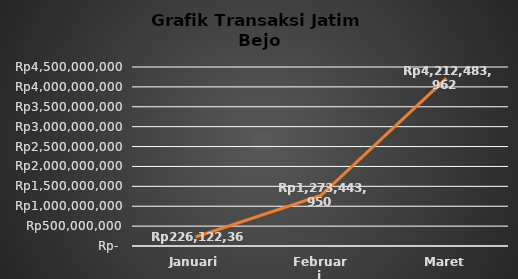
| Category | Total Transaksi |
|---|---|
| Januari | 226122363.65 |
| Februari | 1273443950 |
| Maret | 4212483961.5 |